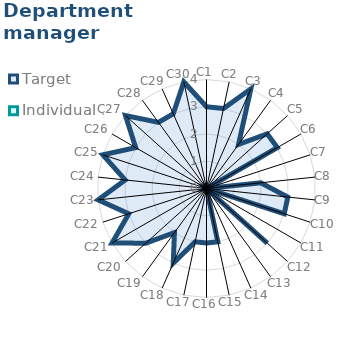
| Category | Target | Individual 3 |
|---|---|---|
| C1 | 3 | 0 |
| C2 | 3 | 0 |
| C3 | 4 | 0 |
| C4 | 2 | 0 |
| C5 | 3 | 0 |
| C6 | 3 | 0 |
| C7 | 0 | 0 |
| C8 | 2 | 0 |
| C9 | 3 | 0 |
| C10 | 3 | 0 |
| C11 | 0 | 0 |
| C12 | 3 | 0 |
| C13 | 0 | 0 |
| C14 | 0 | 0 |
| C15 | 2 | 0 |
| C16 | 2 | 0 |
| C17 | 2 | 0 |
| C18 | 3 | 0 |
| C19 | 2 | 0 |
| C20 | 3 | 0 |
| C21 | 4 | 0 |
| C22 | 3 | 0 |
| C23 | 4 | 0 |
| C24 | 3 | 0 |
| C25 | 4 | 0 |
| C26 | 3 | 0 |
| C27 | 4 | 0 |
| C28 | 3 | 0 |
| C29 | 3 | 0 |
| C30 | 4 | 0 |